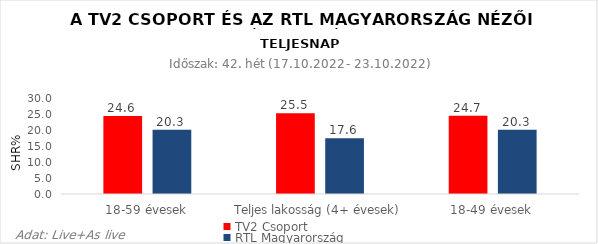
| Category | TV2 Csoport | RTL Magyarország |
|---|---|---|
| 18-59 évesek | 24.6 | 20.3 |
| Teljes lakosság (4+ évesek) | 25.5 | 17.6 |
| 18-49 évesek | 24.7 | 20.3 |